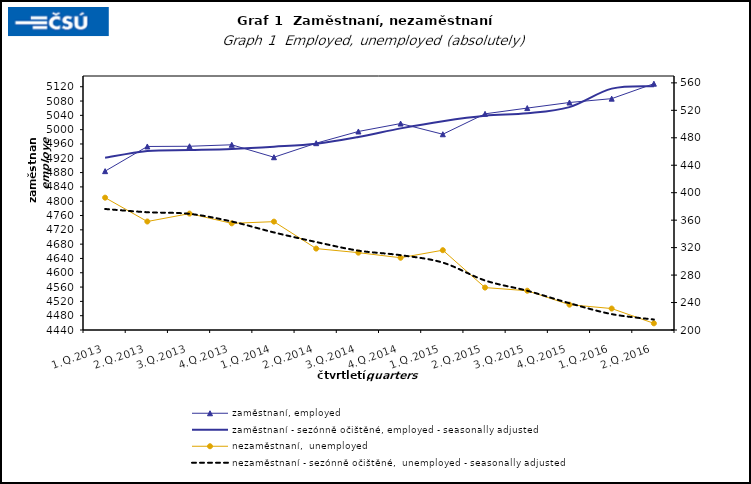
| Category | zaměstnaní, employed | zaměstnaní - sezónně očištěné, employed - seasonally adjusted |
|---|---|---|
| 1.Q.2013 | 4884.025 | 4921.298 |
| 2.Q.2013 | 4952.991 | 4940.38 |
| 3.Q.2013 | 4953.606 | 4943.118 |
| 4.Q.2013 | 4957.713 | 4946.225 |
| 1.Q.2014 | 4922.963 | 4952.405 |
| 2.Q.2014 | 4962.219 | 4960.65 |
| 3.Q.2014 | 4994.947 | 4979.618 |
| 4.Q.2014 | 5017.051 | 5003.629 |
| 1.Q.2015 | 4987.141 | 5023.827 |
| 2.Q.2015 | 5044.285 | 5038.984 |
| 3.Q.2015 | 5060.3 | 5045.647 |
| 4.Q.2015 | 5075.884 | 5063.085 |
| 1.Q.2016 | 5086.671 | 5114.698 |
| 2.Q.2016 | 5128.493 | 5121.602 |